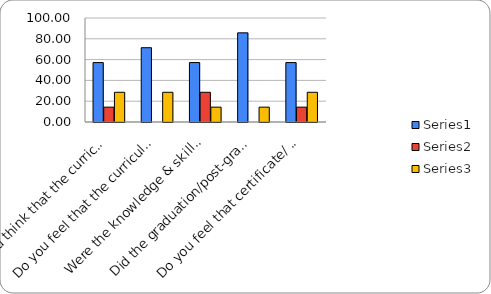
| Category | Series 0 | Series 1 | Series 2 |
|---|---|---|---|
| Do you think that the curriculum which you had during your graduation/post graduation has provided you with the knowledge & skills necessary to get employed/Self-employed or start own business? | 57.143 | 14.286 | 28.571 |
| Do you feel that the curriculum you studied is helpful in progression to higher studies? | 71.429 | 0 | 28.571 |
| Were the knowledge & skills acquired through the curriculum useful to you while working on the job?   | 57.143 | 28.571 | 14.286 |
| Did the graduation/post-graduation programme bring about any attitudinal and behavioural change in you? | 85.714 | 0 | 14.286 |
| Do you feel that certificate/ diploma courses offered by the college in addition to the curriculum lead to better career prospects? | 57.143 | 14.286 | 28.571 |